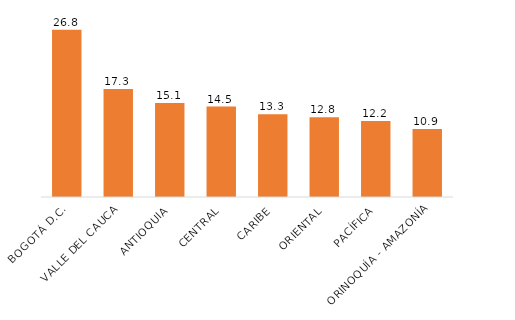
| Category | Indice ED |
|---|---|
| BOGOTÁ D.C. | 26.838 |
| VALLE DEL CAUCA | 17.315 |
| ANTIOQUIA | 15.081 |
| CENTRAL | 14.516 |
| CARIBE | 13.287 |
| ORIENTAL | 12.808 |
| PACÍFICA | 12.181 |
| ORINOQUÍA - AMAZONÍA | 10.928 |